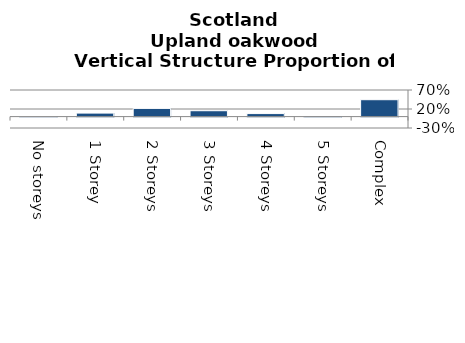
| Category | Upland oakwood |
|---|---|
| No storeys | 0 |
| 1 Storey | 0.091 |
| 2 Storeys | 0.215 |
| 3 Storeys | 0.154 |
| 4 Storeys | 0.079 |
| 5 Storeys | 0.015 |
| Complex | 0.444 |